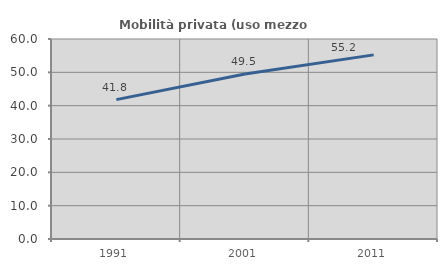
| Category | Mobilità privata (uso mezzo privato) |
|---|---|
| 1991.0 | 41.821 |
| 2001.0 | 49.472 |
| 2011.0 | 55.241 |